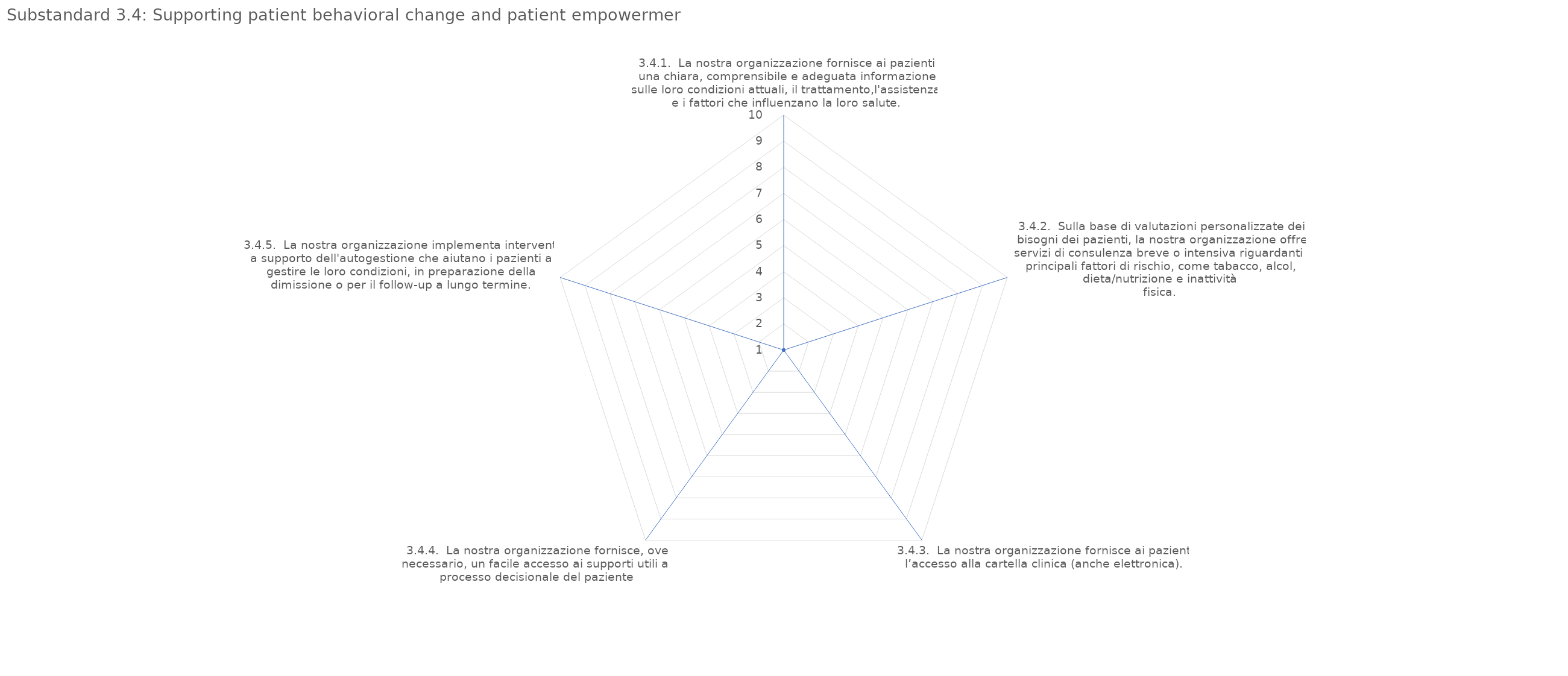
| Category | value |
|---|---|
| 3.4.1.  La nostra organizzazione fornisce ai pazienti una chiara, comprensibile e adeguata informazione sulle loro condizioni attuali, il trattamento,l'assistenza e i fattori che influenzano la loro salute. | 1 |
| 3.4.2.  Sulla base di valutazioni personalizzate dei bisogni dei pazienti, la nostra organizzazione offre servizi di consulenza breve o intensiva riguardanti i principali fattori di rischio, come tabacco, alcol, dieta/nutrizione e inattività
fisica. | 1 |
| 3.4.3.  La nostra organizzazione fornisce ai pazienti l’accesso alla cartella clinica (anche elettronica). | 1 |
| 3.4.4.  La nostra organizzazione fornisce, ove necessario, un facile accesso ai supporti utili al processo decisionale del paziente | 1 |
| 3.4.5.  La nostra organizzazione implementa interventi a supporto dell'autogestione che aiutano i pazienti a gestire le loro condizioni, in preparazione della dimissione o per il follow-up a lungo termine. | 1 |